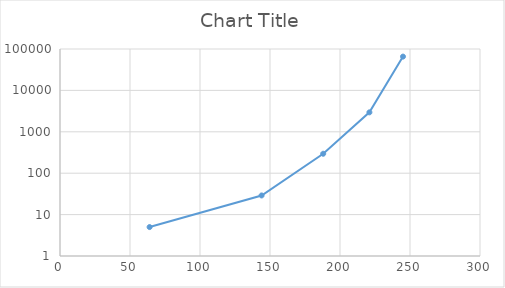
| Category | Series 0 |
|---|---|
| 8.0 | 0 |
| 64.0 | 5 |
| 144.0 | 29 |
| 188.0 | 295 |
| 221.0 | 2949 |
| 245.0 | 65535 |